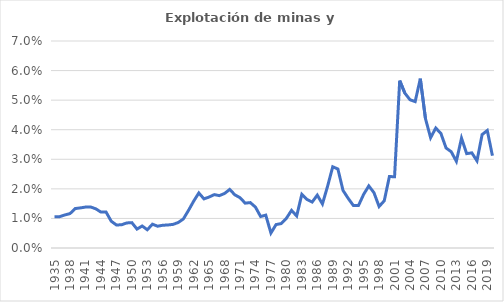
| Category | Explotación de minas y canteras |
|---|---|
| 1935.0 | 0.011 |
| 1936.0 | 0.011 |
| 1937.0 | 0.011 |
| 1938.0 | 0.012 |
| 1939.0 | 0.013 |
| 1940.0 | 0.014 |
| 1941.0 | 0.014 |
| 1942.0 | 0.014 |
| 1943.0 | 0.013 |
| 1944.0 | 0.012 |
| 1945.0 | 0.012 |
| 1946.0 | 0.009 |
| 1947.0 | 0.008 |
| 1948.0 | 0.008 |
| 1949.0 | 0.008 |
| 1950.0 | 0.009 |
| 1951.0 | 0.006 |
| 1952.0 | 0.007 |
| 1953.0 | 0.006 |
| 1954.0 | 0.008 |
| 1955.0 | 0.007 |
| 1956.0 | 0.008 |
| 1957.0 | 0.008 |
| 1958.0 | 0.008 |
| 1959.0 | 0.009 |
| 1960.0 | 0.01 |
| 1961.0 | 0.013 |
| 1962.0 | 0.016 |
| 1963.0 | 0.019 |
| 1964.0 | 0.017 |
| 1965.0 | 0.017 |
| 1966.0 | 0.018 |
| 1967.0 | 0.018 |
| 1968.0 | 0.018 |
| 1969.0 | 0.02 |
| 1970.0 | 0.018 |
| 1971.0 | 0.017 |
| 1972.0 | 0.015 |
| 1973.0 | 0.015 |
| 1974.0 | 0.014 |
| 1975.0 | 0.011 |
| 1976.0 | 0.011 |
| 1977.0 | 0.005 |
| 1978.0 | 0.008 |
| 1979.0 | 0.008 |
| 1980.0 | 0.01 |
| 1981.0 | 0.013 |
| 1982.0 | 0.011 |
| 1983.0 | 0.018 |
| 1984.0 | 0.016 |
| 1985.0 | 0.016 |
| 1986.0 | 0.018 |
| 1987.0 | 0.015 |
| 1988.0 | 0.021 |
| 1989.0 | 0.027 |
| 1990.0 | 0.027 |
| 1991.0 | 0.019 |
| 1992.0 | 0.017 |
| 1993.0 | 0.014 |
| 1994.0 | 0.014 |
| 1995.0 | 0.018 |
| 1996.0 | 0.021 |
| 1997.0 | 0.019 |
| 1998.0 | 0.014 |
| 1999.0 | 0.016 |
| 2000.0 | 0.024 |
| 2001.0 | 0.024 |
| 2002.0 | 0.057 |
| 2003.0 | 0.052 |
| 2004.0 | 0.05 |
| 2005.0 | 0.05 |
| 2006.0 | 0.057 |
| 2007.0 | 0.044 |
| 2008.0 | 0.037 |
| 2009.0 | 0.041 |
| 2010.0 | 0.039 |
| 2011.0 | 0.034 |
| 2012.0 | 0.033 |
| 2013.0 | 0.029 |
| 2014.0 | 0.037 |
| 2015.0 | 0.032 |
| 2016.0 | 0.032 |
| 2017.0 | 0.029 |
| 2018.0 | 0.038 |
| 2019.0 | 0.04 |
| 2020.0 | 0.031 |